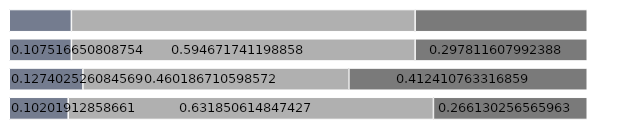
| Category | 15 bis unter 25 Jahre | 25 bis unter 50 Jahre | 50 Jahre und älter |
|---|---|---|---|
| 1 | 0.102 | 0.632 | 0.266 |
| 2 | 0.127 | 0.46 | 0.412 |
| 3 | 0.108 | 0.595 | 0.298 |
| 4 | 0.108 | 0.595 | 0.298 |